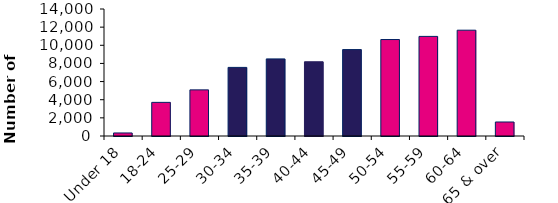
| Category | Series 1 |
|---|---|
| Under 18 | 335 |
| 18-24 | 3708 |
| 25-29 | 5086 |
| 30-34 | 7563 |
| 35-39 | 8500 |
| 40-44 | 8182 |
| 45-49 | 9525 |
| 50-54 | 10633 |
| 55-59 | 10979 |
| 60-64 | 11664 |
| 65 & over | 1545 |